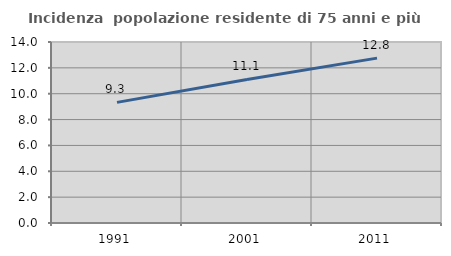
| Category | Incidenza  popolazione residente di 75 anni e più |
|---|---|
| 1991.0 | 9.331 |
| 2001.0 | 11.102 |
| 2011.0 | 12.753 |